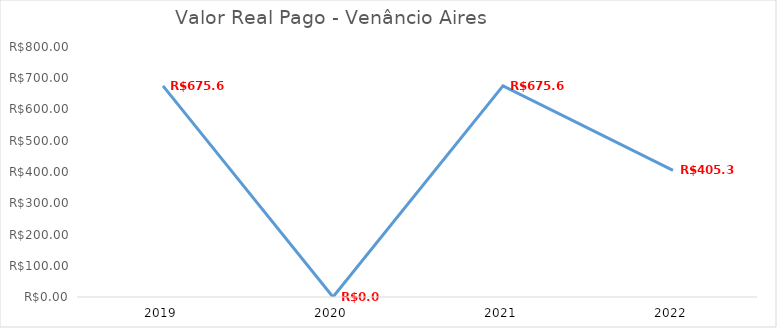
| Category | Series 0 |
|---|---|
| 2019.0 | 675.65 |
| 2020.0 | 0 |
| 2021.0 | 675.65 |
| 2022.0 | 405.39 |